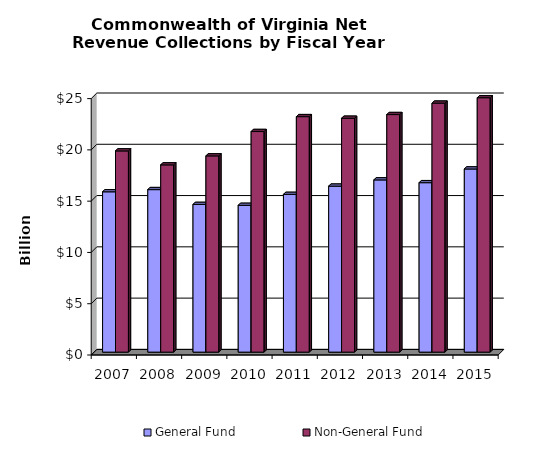
| Category | General Fund | Non-General Fund  |
|---|---|---|
| 2007.0 | 15.633 | 19.618 |
| 2008.0 | 15.845 | 18.257 |
| 2009.0 | 14.398 | 19.134 |
| 2010.0 | 14.31 | 21.508 |
| 2011.0 | 15.379 | 22.96 |
| 2012.0 | 16.182 | 22.803 |
| 2013.0 | 16.792 | 23.162 |
| 2014.0 | 16.52 | 24.275 |
| 2015.0 | 17.857 | 24.805 |